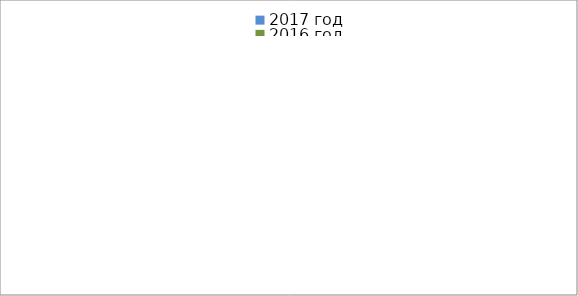
| Category | 2017 год | 2016 год |
|---|---|---|
|  - поджог | 7 | 9 |
|  - неосторожное обращение с огнём | 1 | 2 |
|  - НПТЭ электрооборудования | 12 | 7 |
|  - НПУ и Э печей | 33 | 24 |
|  - НПУ и Э транспортных средств | 25 | 30 |
|   -Шалость с огнем детей | 3 | 3 |
|  -НППБ при эксплуатации эл.приборов | 12 | 18 |
|  - курение | 13 | 15 |
| - прочие | 29 | 35 |
| - не установленные причины | 0 | 0 |